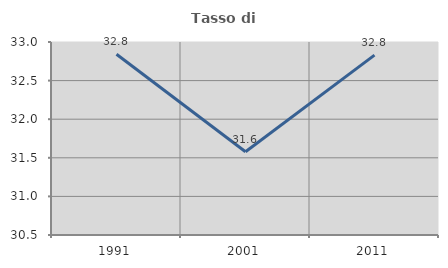
| Category | Tasso di occupazione   |
|---|---|
| 1991.0 | 32.841 |
| 2001.0 | 31.579 |
| 2011.0 | 32.83 |